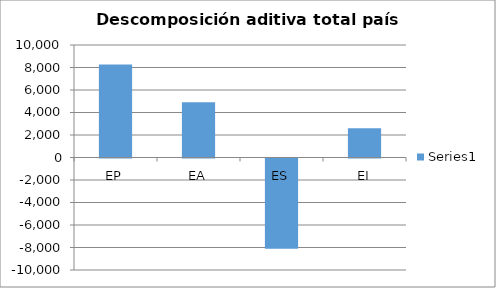
| Category | Series 0 |
|---|---|
| EP | 8270.025 |
| EA | 4906.818 |
| ES | -8021.381 |
| EI | 2600.832 |